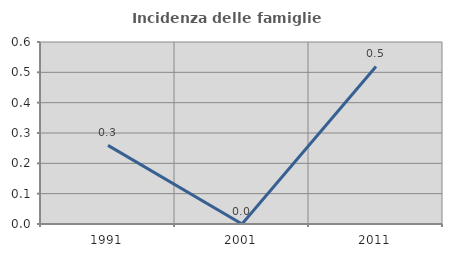
| Category | Incidenza delle famiglie numerose |
|---|---|
| 1991.0 | 0.259 |
| 2001.0 | 0 |
| 2011.0 | 0.519 |